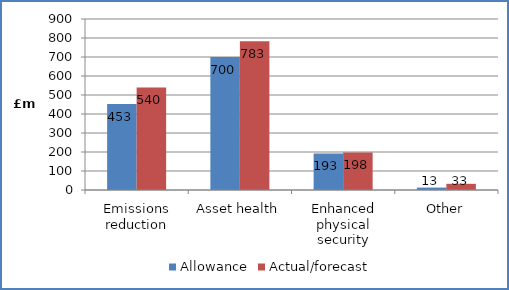
| Category | Allowance | Actual/forecast |
|---|---|---|
| Emissions reduction | 452.72 | 539.964 |
| Asset health | 699.542 | 782.707 |
| Enhanced physical security | 192.521 | 197.829 |
| Other | 12.739 | 32.548 |